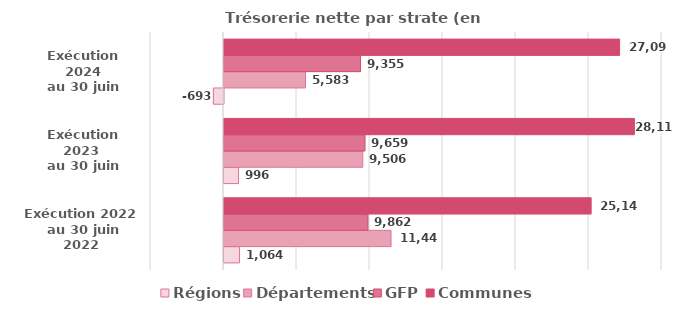
| Category | Régions | Départements | GFP | Communes  |
|---|---|---|---|---|
| Exécution 2022
 au 30 juin 2022 | 1064 | 11441.7 | 9861.8 | 25147.6 |
| Exécution 2023 
au 30 juin 2023 | 996.1 | 9505.9 | 9658.5 | 28112.1 |
| Exécution 2024
au 30 juin 2024 | -693.3 | 5583 | 9355.3 | 27095.7 |